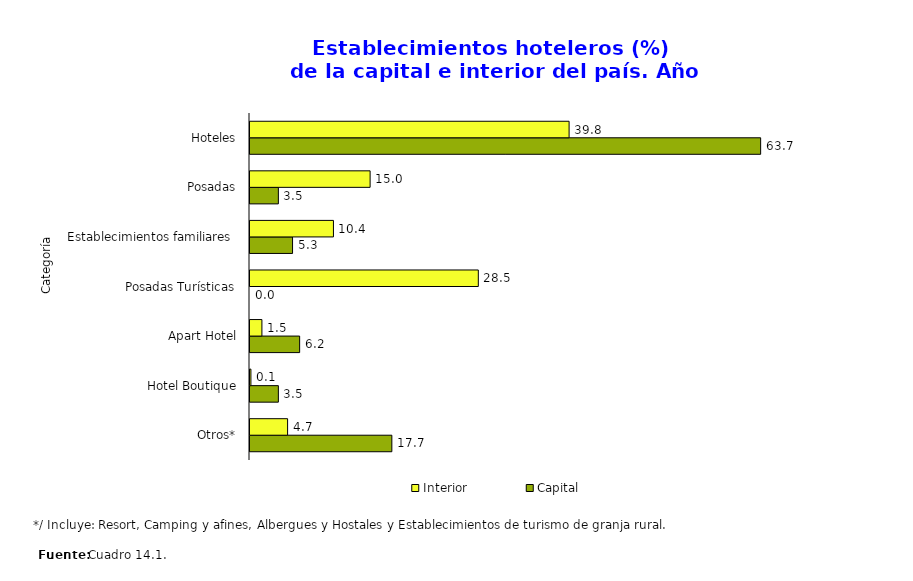
| Category | Capital | Interior |
|---|---|---|
| Otros* | 17.699 | 4.691 |
| Hotel Boutique | 3.54 | 0.114 |
| Apart Hotel | 6.195 | 1.487 |
| Posadas Turísticas | 0 | 28.49 |
| Establecimientos familiares  | 5.31 | 10.412 |
| Posadas | 3.54 | 14.989 |
| Hoteles | 63.717 | 39.817 |